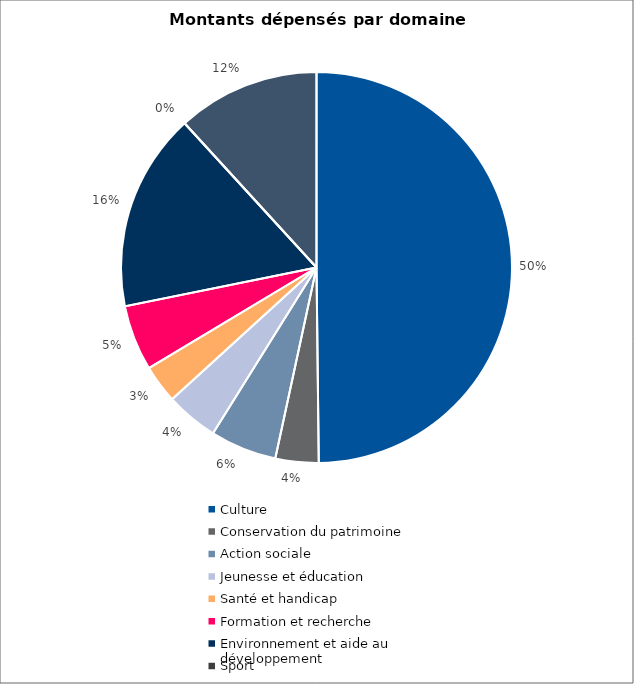
| Category | Series 0 |
|---|---|
| Culture | 2330490 |
| Conservation du patrimoine | 167000 |
| Action sociale | 257200 |
| Jeunesse et éducation | 203600 |
| Santé et handicap | 148000 |
| Formation et recherche | 253500 |
| Environnement et aide au
développement | 767000 |
| Sport | 0 |
| Autres projets d’utilité publique | 551618 |